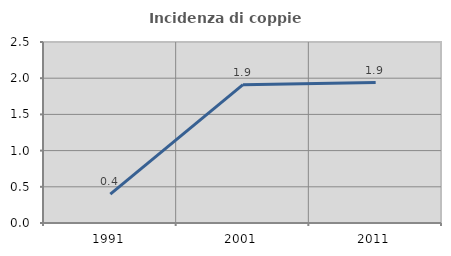
| Category | Incidenza di coppie miste |
|---|---|
| 1991.0 | 0.398 |
| 2001.0 | 1.911 |
| 2011.0 | 1.94 |